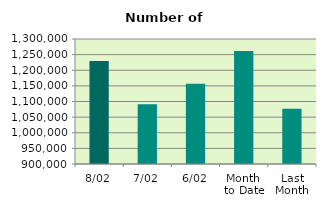
| Category | Series 0 |
|---|---|
| 8/02 | 1229876 |
| 7/02 | 1091114 |
| 6/02 | 1156558 |
| Month 
to Date | 1261263.333 |
| Last
Month | 1077187.636 |